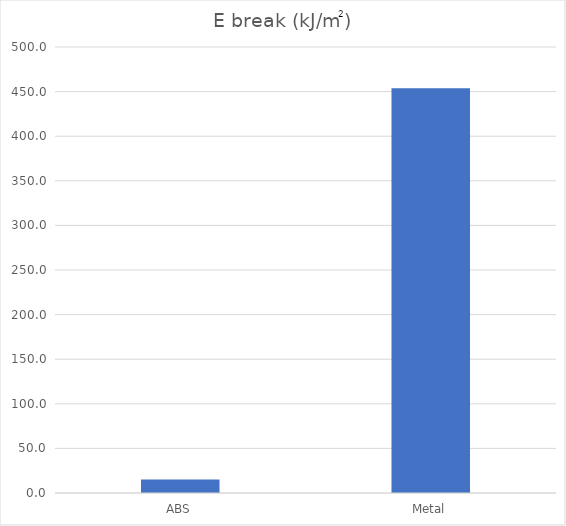
| Category | kJ/m2 |
|---|---|
| ABS | 15.022 |
| Metal | 453.713 |